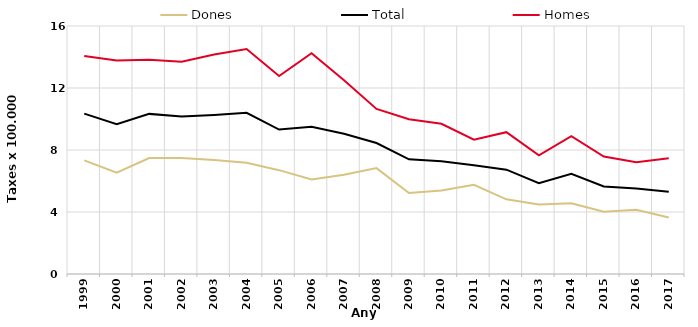
| Category | Dones | Total | Homes |
|---|---|---|---|
| 1999.0 | 7.33 | 10.35 | 14.07 |
| 2000.0 | 6.53 | 9.66 | 13.77 |
| 2001.0 | 7.48 | 10.33 | 13.82 |
| 2002.0 | 7.49 | 10.16 | 13.69 |
| 2003.0 | 7.36 | 10.26 | 14.16 |
| 2004.0 | 7.17 | 10.4 | 14.51 |
| 2005.0 | 6.7 | 9.32 | 12.77 |
| 2006.0 | 6.1 | 9.5 | 14.24 |
| 2007.0 | 6.41 | 9.05 | 12.5 |
| 2008.0 | 6.83 | 8.45 | 10.65 |
| 2009.0 | 5.23 | 7.4 | 9.99 |
| 2010.0 | 5.39 | 7.28 | 9.69 |
| 2011.0 | 5.75 | 7.02 | 8.66 |
| 2012.0 | 4.82 | 6.73 | 9.15 |
| 2013.0 | 4.49 | 5.86 | 7.65 |
| 2014.0 | 4.57 | 6.47 | 8.89 |
| 2015.0 | 4.02 | 5.65 | 7.58 |
| 2016.0 | 4.14 | 5.52 | 7.21 |
| 2017.0 | 3.64 | 5.3 | 7.47 |